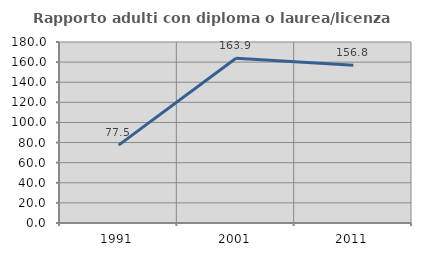
| Category | Rapporto adulti con diploma o laurea/licenza media  |
|---|---|
| 1991.0 | 77.477 |
| 2001.0 | 163.918 |
| 2011.0 | 156.818 |